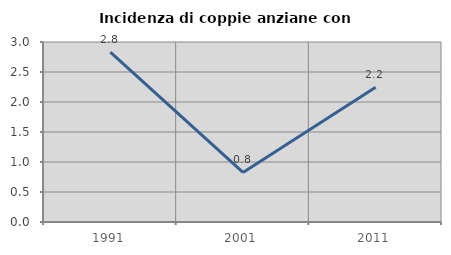
| Category | Incidenza di coppie anziane con figli |
|---|---|
| 1991.0 | 2.83 |
| 2001.0 | 0.826 |
| 2011.0 | 2.247 |